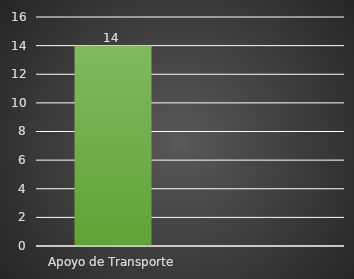
| Category | INDICADOR  |
|---|---|
| Apoyo de Transporte | 14 |